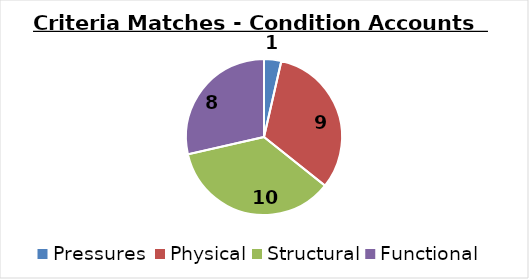
| Category | Matches |
|---|---|
| Pressures  | 1 |
| Physical | 9 |
| Structural | 10 |
| Functional | 8 |